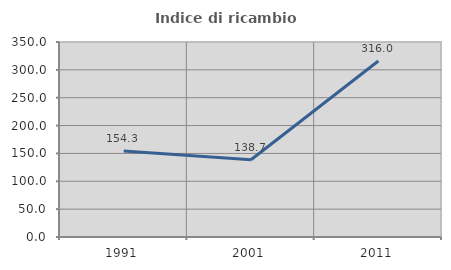
| Category | Indice di ricambio occupazionale  |
|---|---|
| 1991.0 | 154.331 |
| 2001.0 | 138.739 |
| 2011.0 | 316 |